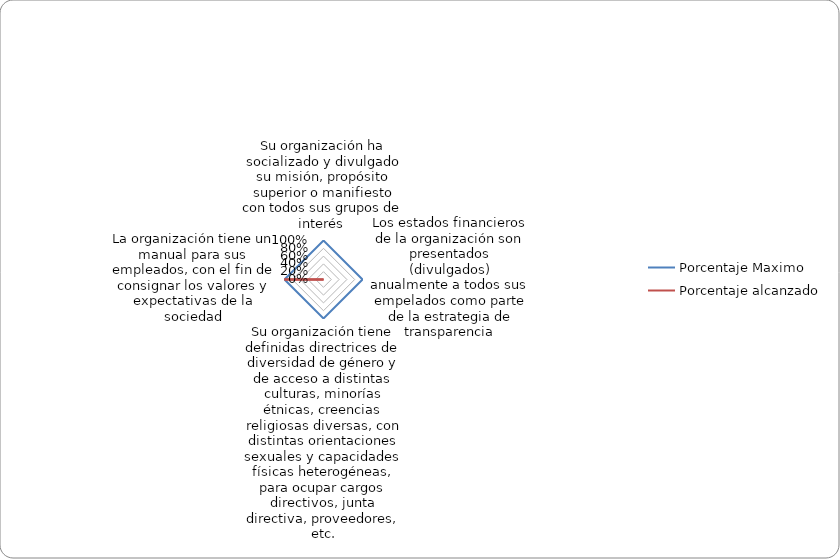
| Category | Porcentaje Maximo | Porcentaje alcanzado |
|---|---|---|
| Su organización ha socializado y divulgado su misión, propósito superior o manifiesto con todos sus grupos de interés  | 1 | 0 |
| Los estados financieros de la organización son presentados (divulgados) anualmente a todos sus empelados como parte de la estrategia de transparencia | 1 | 0 |
| Su organización tiene definidas directrices de diversidad de género y de acceso a distintas culturas, minorías étnicas, creencias religiosas diversas, con distintas orientaciones sexuales y capacidades físicas heterogéneas, para ocupar cargos directivos, j | 1 | 0 |
| La organización tiene un manual para sus empleados, con el fin de consignar los valores y expectativas de la sociedad | 1 | 1 |